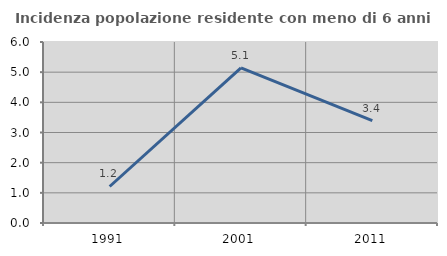
| Category | Incidenza popolazione residente con meno di 6 anni |
|---|---|
| 1991.0 | 1.21 |
| 2001.0 | 5.14 |
| 2011.0 | 3.395 |